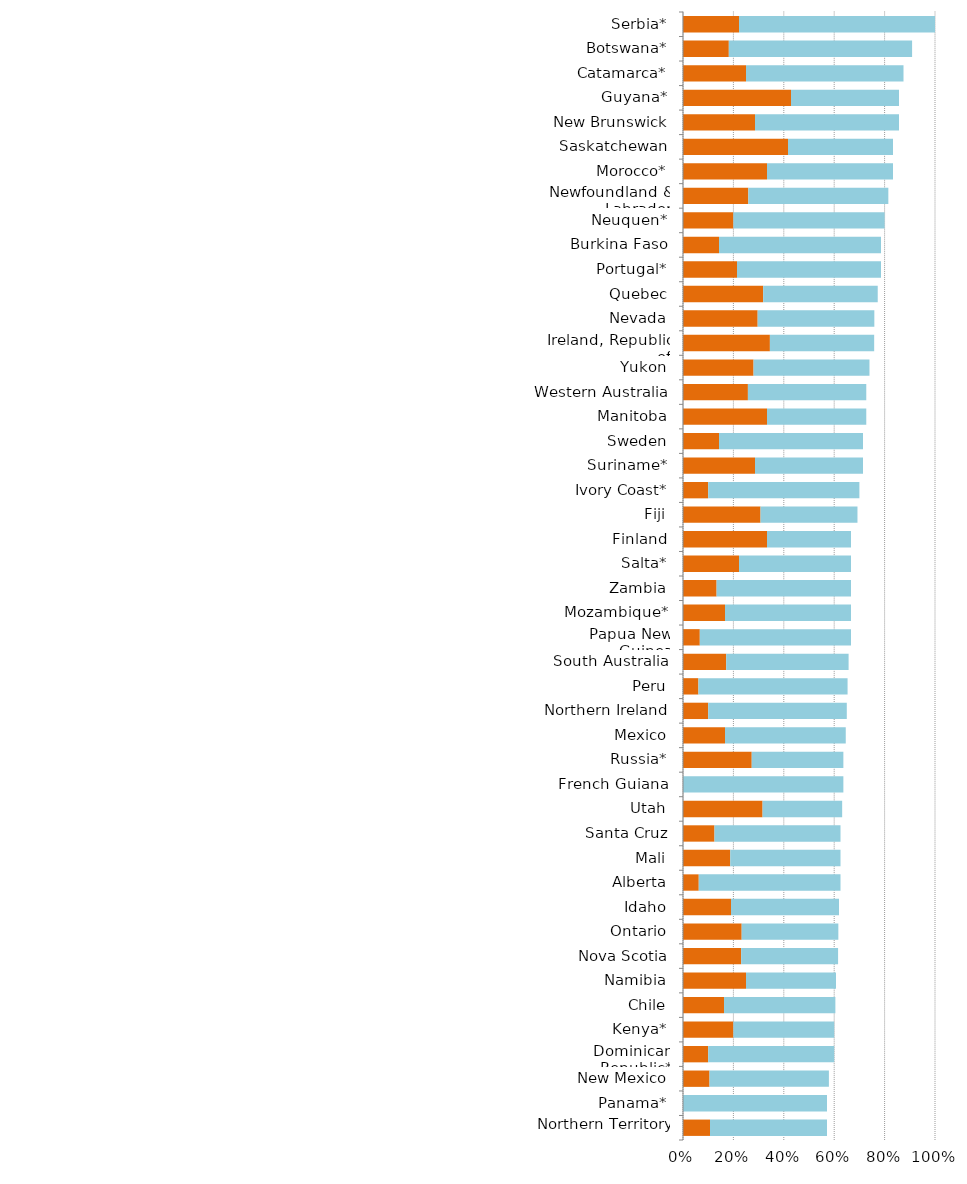
| Category | Series 0 | Series 1 |
|---|---|---|
| Northern Territory | 0.107 | 0.464 |
| Panama* | 0 | 0.571 |
| New Mexico | 0.105 | 0.474 |
| Dominican Republic* | 0.1 | 0.5 |
| Kenya* | 0.2 | 0.4 |
| Chile | 0.163 | 0.442 |
| Namibia | 0.25 | 0.357 |
| Nova Scotia | 0.231 | 0.385 |
| Ontario | 0.233 | 0.384 |
| Idaho | 0.19 | 0.429 |
| Alberta | 0.062 | 0.562 |
| Mali | 0.188 | 0.438 |
| Santa Cruz | 0.125 | 0.5 |
| Utah | 0.316 | 0.316 |
| French Guiana | 0 | 0.636 |
| Russia* | 0.273 | 0.364 |
| Mexico | 0.167 | 0.479 |
| Northern Ireland | 0.1 | 0.55 |
| Peru | 0.061 | 0.592 |
| South Australia | 0.171 | 0.486 |
| Papua New Guinea | 0.067 | 0.6 |
| Mozambique* | 0.167 | 0.5 |
| Zambia | 0.133 | 0.533 |
| Salta* | 0.222 | 0.444 |
| Finland | 0.333 | 0.333 |
| Fiji | 0.308 | 0.385 |
| Ivory Coast* | 0.1 | 0.6 |
| Suriname* | 0.286 | 0.429 |
| Sweden | 0.143 | 0.571 |
| Manitoba | 0.333 | 0.394 |
| Western Australia | 0.258 | 0.47 |
| Yukon | 0.28 | 0.46 |
| Ireland, Republic of | 0.345 | 0.414 |
| Nevada | 0.296 | 0.463 |
| Quebec | 0.318 | 0.455 |
| Portugal* | 0.214 | 0.571 |
| Burkina Faso | 0.143 | 0.643 |
| Neuquen* | 0.2 | 0.6 |
| Newfoundland & Labrador | 0.259 | 0.556 |
| Morocco* | 0.333 | 0.5 |
| Saskatchewan | 0.417 | 0.417 |
| New Brunswick | 0.286 | 0.571 |
| Guyana* | 0.429 | 0.429 |
| Catamarca* | 0.25 | 0.625 |
| Botswana* | 0.182 | 0.727 |
| Serbia* | 0.222 | 0.778 |